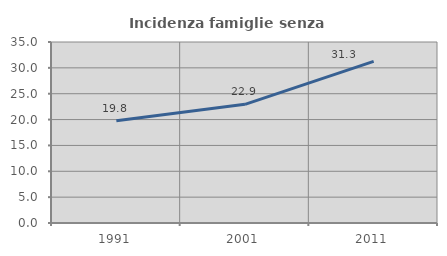
| Category | Incidenza famiglie senza nuclei |
|---|---|
| 1991.0 | 19.76 |
| 2001.0 | 22.941 |
| 2011.0 | 31.25 |